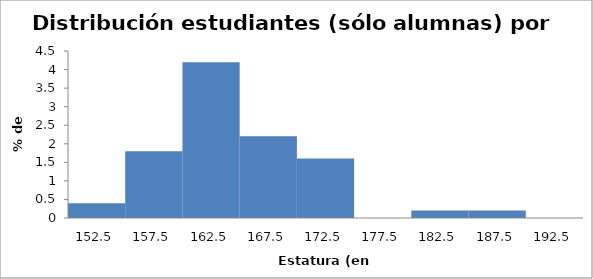
| Category | Series 0 |
|---|---|
| 152.5 | 0.4 |
| 157.5 | 1.8 |
| 162.5 | 4.2 |
| 167.5 | 2.2 |
| 172.5 | 1.6 |
| 177.5 | 0 |
| 182.5 | 0.2 |
| 187.5 | 0.2 |
| 192.5 | 0 |